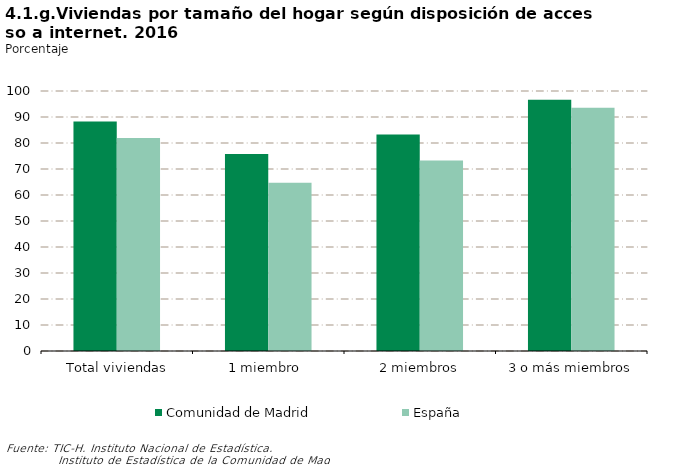
| Category | Comunidad de Madrid | España |
|---|---|---|
| Total viviendas | 88.307 | 81.931 |
| 1 miembro  | 75.811 | 64.674 |
| 2 miembros | 83.232 | 73.23 |
| 3 o más miembros | 96.63 | 93.567 |